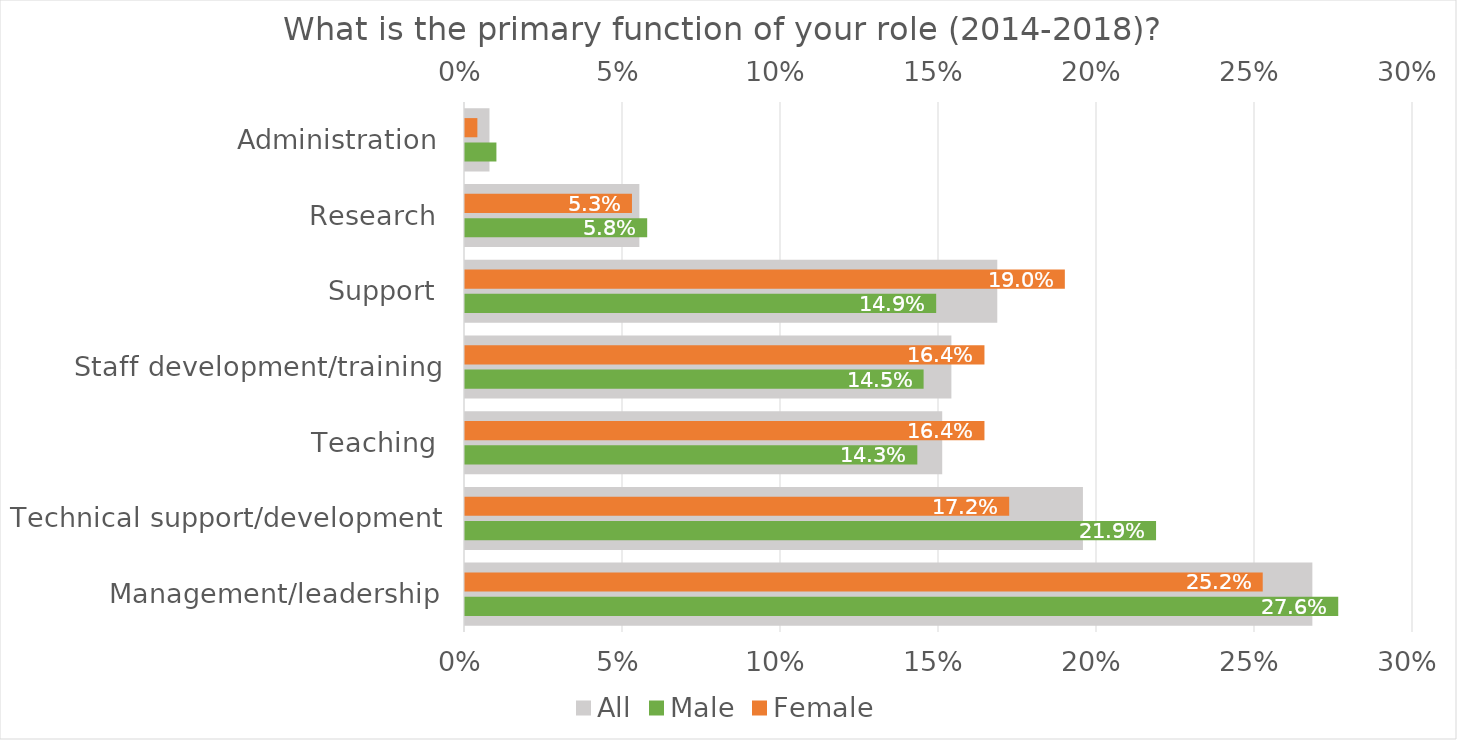
| Category | All |
|---|---|
| Management/leadership | 0.268 |
| Technical support/development | 0.196 |
| Teaching | 0.151 |
| Staff development/training | 0.154 |
| Support | 0.168 |
| Research | 0.055 |
| Administration | 0.008 |